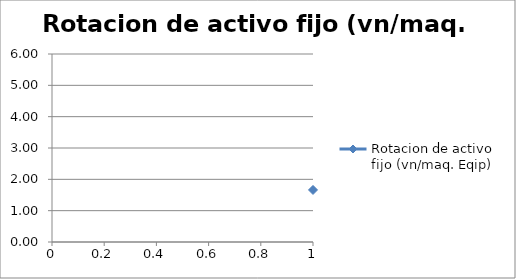
| Category | Rotacion de activo fijo (vn/maq. Eqip) |
|---|---|
| 0 | 1.662 |
| 1 | 3.804 |
| 2 | 3.456 |
| 3 | 3.989 |
| 4 | 2.832 |
| 5 | 5.015 |
| 6 | 4.136 |
| 7 | 4.664 |